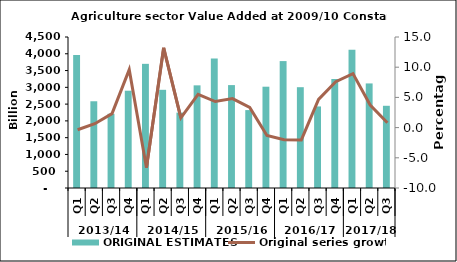
| Category | ORIGINAL ESTIMATES |
|---|---|
| 0 | 3963.894 |
| 1 | 2584.845 |
| 2 | 2210.77 |
| 3 | 2899.306 |
| 4 | 3700.255 |
| 5 | 2926.244 |
| 6 | 2246.705 |
| 7 | 3059.094 |
| 8 | 3860.012 |
| 9 | 3066.695 |
| 10 | 2321.916 |
| 11 | 3018.893 |
| 12 | 3782.284 |
| 13 | 3004.108 |
| 14 | 2430.526 |
| 15 | 3248.135 |
| 16 | 4120.108 |
| 17 | 3116.291 |
| 18 | 2450.104 |